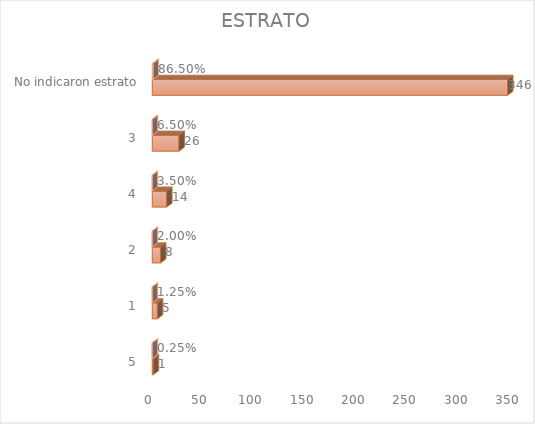
| Category | Cuenta de Número petición | Cuenta de Número petición2 |
|---|---|---|
| 5 | 1 | 0.002 |
| 1 | 5 | 0.012 |
| 2 | 8 | 0.02 |
| 4 | 14 | 0.035 |
| 3 | 26 | 0.065 |
| No indicaron estrato | 346 | 0.865 |